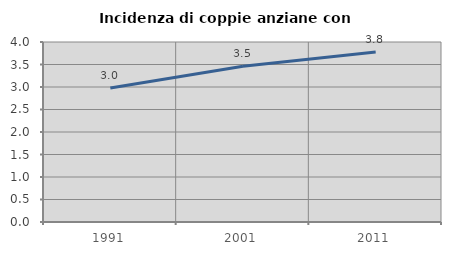
| Category | Incidenza di coppie anziane con figli |
|---|---|
| 1991.0 | 2.976 |
| 2001.0 | 3.459 |
| 2011.0 | 3.78 |